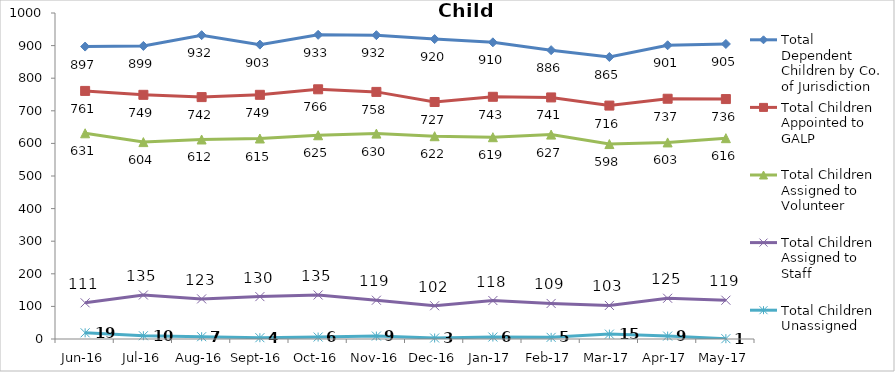
| Category | Total Dependent Children by Co. of Jurisdiction | Total Children Appointed to GALP | Total Children Assigned to Volunteer | Total Children Assigned to Staff | Total Children Unassigned |
|---|---|---|---|---|---|
| Jun-16 | 897 | 761 | 631 | 111 | 19 |
| Jul-16 | 899 | 749 | 604 | 135 | 10 |
| Aug-16 | 932 | 742 | 612 | 123 | 7 |
| Sep-16 | 903 | 749 | 615 | 130 | 4 |
| Oct-16 | 933 | 766 | 625 | 135 | 6 |
| Nov-16 | 932 | 758 | 630 | 119 | 9 |
| Dec-16 | 920 | 727 | 622 | 102 | 3 |
| Jan-17 | 910 | 743 | 619 | 118 | 6 |
| Feb-17 | 886 | 741 | 627 | 109 | 5 |
| Mar-17 | 865 | 716 | 598 | 103 | 15 |
| Apr-17 | 901 | 737 | 603 | 125 | 9 |
| May-17 | 905 | 736 | 616 | 119 | 1 |